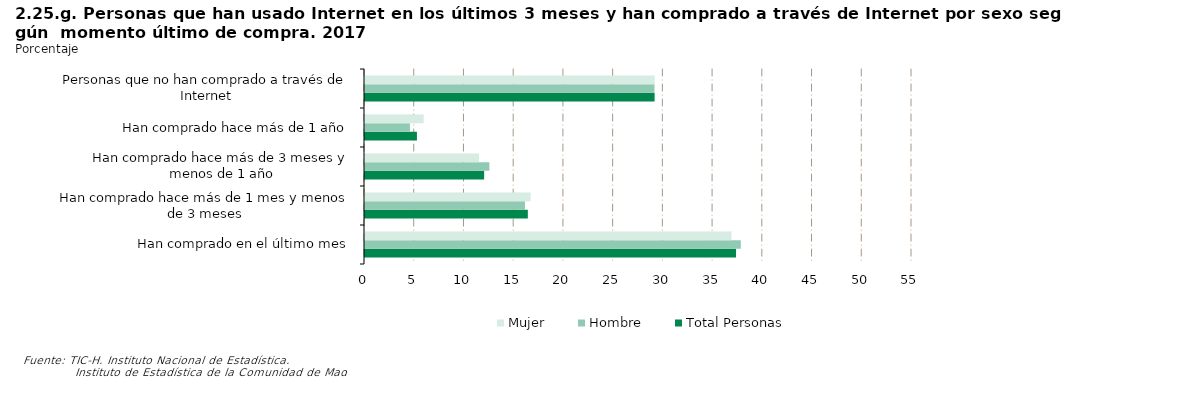
| Category | Total Personas | Hombre | Mujer |
|---|---|---|---|
| Han comprado en el último mes | 37.308 | 37.787 | 36.846 |
| Han comprado hace más de 1 mes y menos de 3 meses | 16.372 | 16.085 | 16.649 |
| Han comprado hace más de 3 meses y menos de 1 año | 11.98 | 12.508 | 11.47 |
| Han comprado hace más de 1 año | 5.221 | 4.516 | 5.903 |
| Personas que no han comprado a través de Internet | 29.119 | 29.105 | 29.133 |